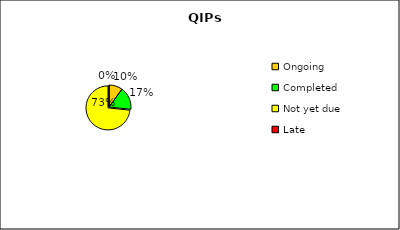
| Category | Series 0 |
|---|---|
| Ongoing | 3 |
| Completed | 5 |
| Not yet due | 22 |
| Late | 0 |